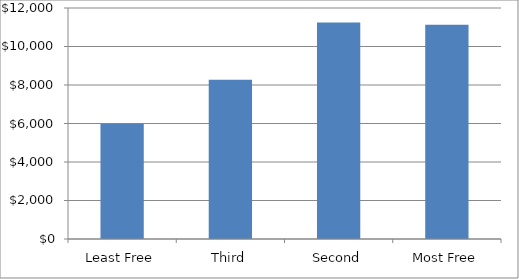
| Category | Series 0 |
|---|---|
| Least Free | 5988.859 |
| Third | 8276.174 |
| Second | 11245.238 |
| Most Free | 11136.278 |